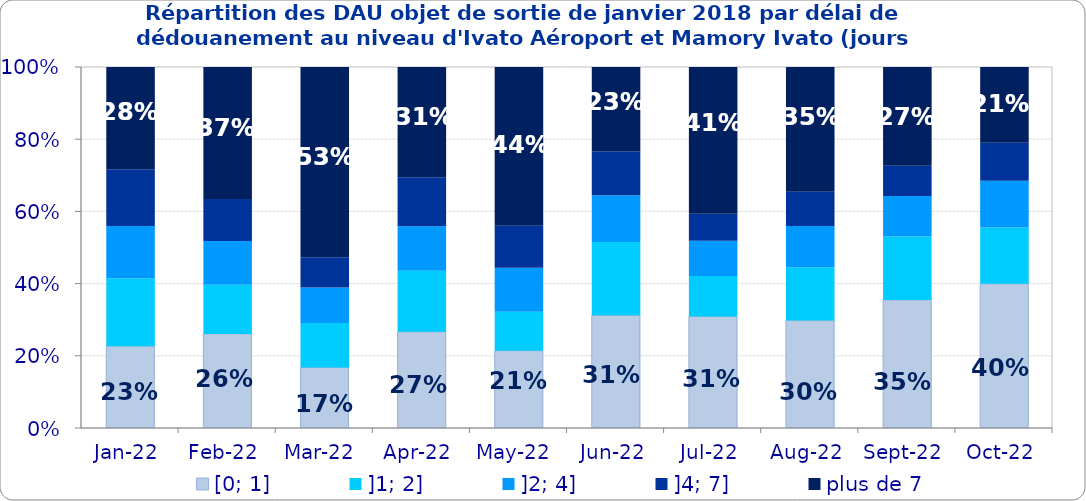
| Category | [0; 1] | ]1; 2] | ]2; 4] | ]4; 7] | plus de 7 |
|---|---|---|---|---|---|
| 2022-01-01 | 0.227 | 0.188 | 0.145 | 0.158 | 0.283 |
| 2022-02-01 | 0.261 | 0.136 | 0.121 | 0.116 | 0.366 |
| 2022-03-01 | 0.168 | 0.123 | 0.098 | 0.083 | 0.527 |
| 2022-04-01 | 0.267 | 0.169 | 0.123 | 0.136 | 0.305 |
| 2022-05-01 | 0.214 | 0.108 | 0.122 | 0.116 | 0.44 |
| 2022-06-01 | 0.312 | 0.203 | 0.129 | 0.122 | 0.233 |
| 2022-07-01 | 0.309 | 0.112 | 0.098 | 0.074 | 0.407 |
| 2022-08-01 | 0.298 | 0.148 | 0.114 | 0.095 | 0.345 |
| 2022-09-01 | 0.355 | 0.175 | 0.112 | 0.084 | 0.273 |
| 2022-10-01 | 0.399 | 0.156 | 0.13 | 0.105 | 0.21 |